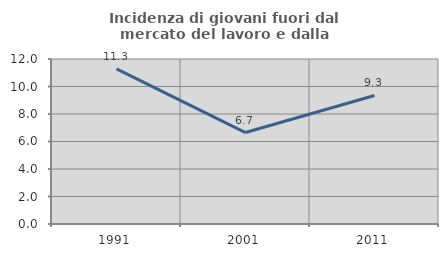
| Category | Incidenza di giovani fuori dal mercato del lavoro e dalla formazione  |
|---|---|
| 1991.0 | 11.279 |
| 2001.0 | 6.651 |
| 2011.0 | 9.346 |